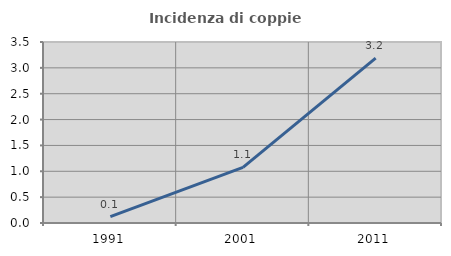
| Category | Incidenza di coppie miste |
|---|---|
| 1991.0 | 0.124 |
| 2001.0 | 1.076 |
| 2011.0 | 3.189 |